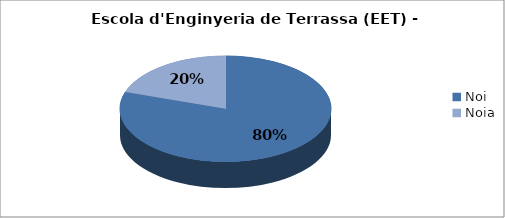
| Category | Escola d'Enginyeria de Terrassa (EET) - Gènere |
|---|---|
| Noi | 0.801 |
| Noia | 0.199 |